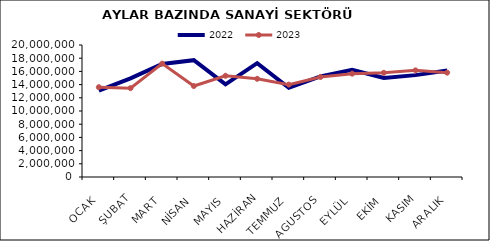
| Category | 2022 | 2023 |
|---|---|---|
| OCAK | 13084912.821 | 13609113.072 |
| ŞUBAT | 14949769.153 | 13457418.638 |
| MART | 17127785.439 | 17176145.35 |
| NİSAN | 17696509.005 | 13785695.028 |
| MAYIS | 14045065.862 | 15339641.981 |
| HAZİRAN | 17242348.724 | 14881117.977 |
| TEMMUZ | 13507728.33 | 13998613.256 |
| AGUSTOS | 15242653.114 | 15156613.534 |
| EYLÜL | 16228532.153 | 15656526.162 |
| EKİM | 15003243.783 | 15789232.432 |
| KASIM | 15436279.747 | 16156859.742 |
| ARALIK | 16129423.487 | 15811645.717 |